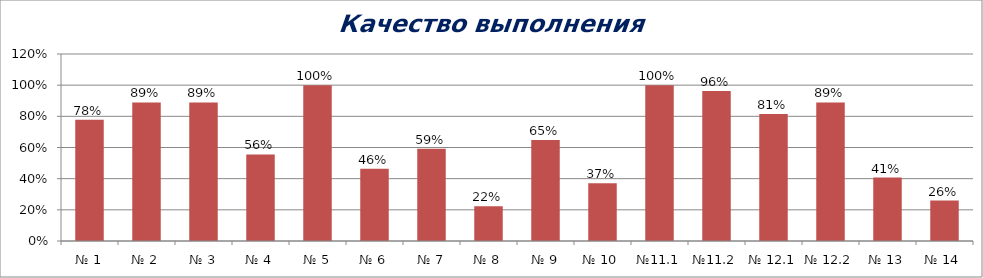
| Category | Series 0 |
|---|---|
| № 1 | 0.778 |
| № 2 | 0.889 |
| № 3 | 0.889 |
| № 4 | 0.556 |
| № 5 | 1 |
| № 6 | 0.463 |
| № 7 | 0.593 |
| № 8 | 0.222 |
| № 9 | 0.648 |
| № 10 | 0.37 |
| №11.1 | 1 |
| №11.2 | 0.963 |
| № 12.1 | 0.815 |
| № 12.2 | 0.889 |
| № 13 | 0.407 |
| № 14 | 0.259 |